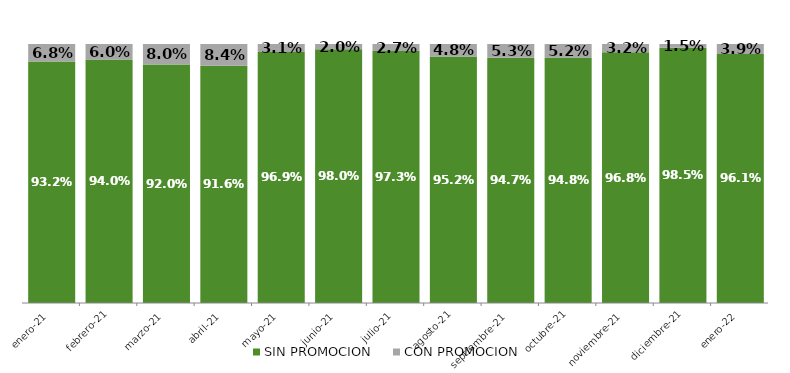
| Category | SIN PROMOCION   | CON PROMOCION   |
|---|---|---|
| 2021-01-01 | 0.932 | 0.068 |
| 2021-02-01 | 0.94 | 0.06 |
| 2021-03-01 | 0.92 | 0.08 |
| 2021-04-01 | 0.916 | 0.084 |
| 2021-05-01 | 0.969 | 0.031 |
| 2021-06-01 | 0.98 | 0.02 |
| 2021-07-01 | 0.973 | 0.027 |
| 2021-08-01 | 0.952 | 0.048 |
| 2021-09-01 | 0.947 | 0.053 |
| 2021-10-01 | 0.948 | 0.052 |
| 2021-11-01 | 0.968 | 0.032 |
| 2021-12-01 | 0.985 | 0.015 |
| 2022-01-01 | 0.961 | 0.039 |